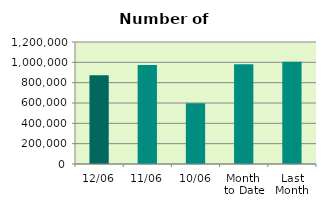
| Category | Series 0 |
|---|---|
| 12/06 | 874032 |
| 11/06 | 974396 |
| 10/06 | 597336 |
| Month 
to Date | 981346.25 |
| Last
Month | 1004730.273 |